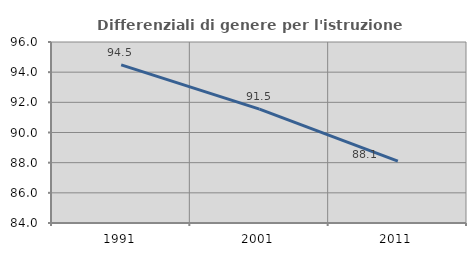
| Category | Differenziali di genere per l'istruzione superiore |
|---|---|
| 1991.0 | 94.488 |
| 2001.0 | 91.547 |
| 2011.0 | 88.107 |